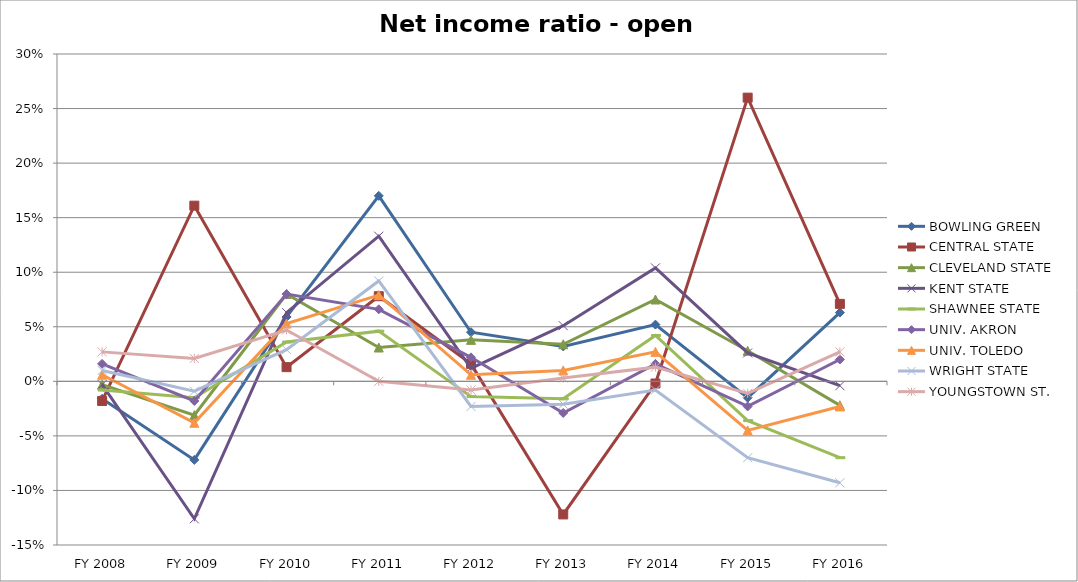
| Category | BOWLING GREEN  | CENTRAL STATE  | CLEVELAND STATE  | KENT STATE  | SHAWNEE STATE  | UNIV. AKRON  | UNIV. TOLEDO  | WRIGHT STATE  | YOUNGSTOWN ST.  |
|---|---|---|---|---|---|---|---|---|---|
| FY 2016 | 0.063 | 0.071 | -0.022 | -0.004 | -0.07 | 0.02 | -0.023 | -0.093 | 0.027 |
| FY 2015 | -0.015 | 0.26 | 0.028 | 0.026 | -0.036 | -0.023 | -0.045 | -0.07 | -0.011 |
| FY 2014 | 0.052 | -0.002 | 0.075 | 0.104 | 0.042 | 0.016 | 0.027 | -0.008 | 0.013 |
| FY 2013 | 0.032 | -0.122 | 0.034 | 0.051 | -0.016 | -0.029 | 0.01 | -0.021 | 0.003 |
| FY 2012 | 0.045 | 0.016 | 0.038 | 0.012 | -0.014 | 0.022 | 0.006 | -0.023 | -0.008 |
| FY 2011 | 0.17 | 0.078 | 0.031 | 0.133 | 0.046 | 0.066 | 0.079 | 0.092 | 0 |
| FY 2010 | 0.059 | 0.013 | 0.08 | 0.063 | 0.036 | 0.08 | 0.053 | 0.029 | 0.047 |
| FY 2009 | -0.072 | 0.161 | -0.031 | -0.126 | -0.015 | -0.018 | -0.038 | -0.009 | 0.021 |
| FY 2008 | -0.016 | -0.018 | -0.003 | -0.003 | -0.008 | 0.016 | 0.006 | 0.01 | 0.027 |